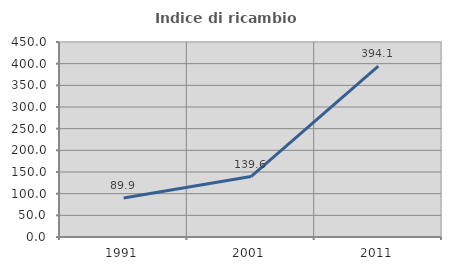
| Category | Indice di ricambio occupazionale  |
|---|---|
| 1991.0 | 89.908 |
| 2001.0 | 139.56 |
| 2011.0 | 394.118 |